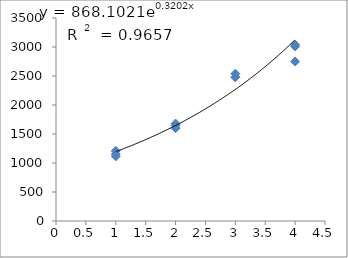
| Category | Series 0 |
|---|---|
| 1.0 | 1210 |
| 1.0 | 1115 |
| 1.0 | 1155 |
| 2.0 | 1680 |
| 2.0 | 1600 |
| 2.0 | 1650 |
| 3.0 | 2540 |
| 3.0 | 2480 |
| 3.0 | 2480 |
| 4.0 | 2750 |
| 4.0 | 3010 |
| 4.0 | 3040 |